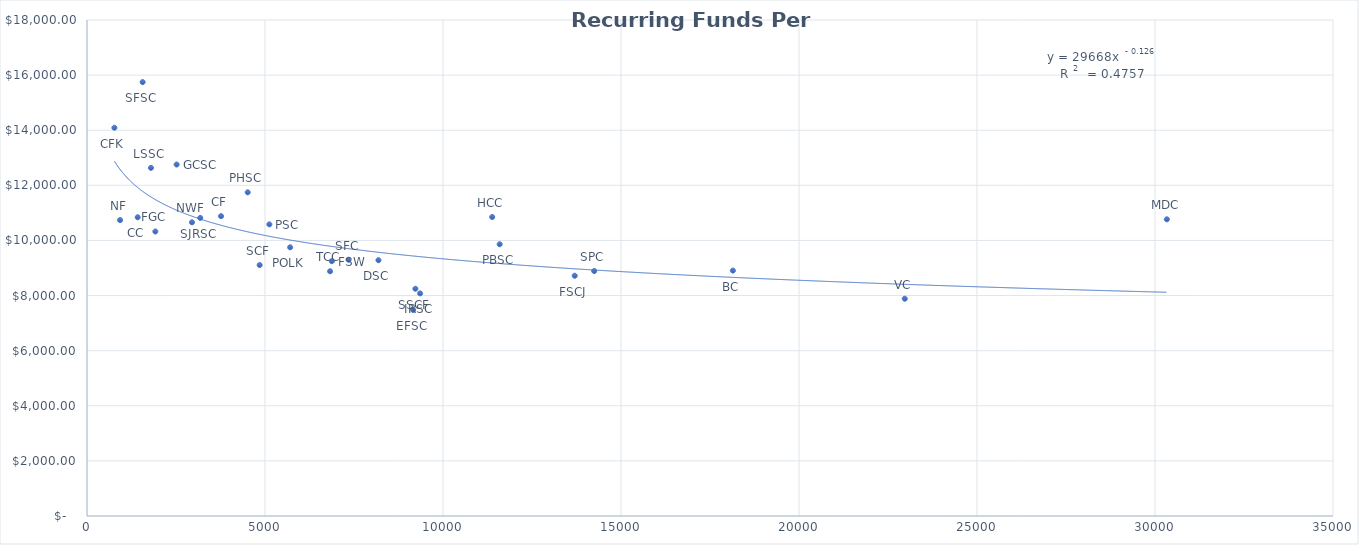
| Category |  Recurring Funds Per Graduate |
|---|---|
| 770.0 | 14090.101 |
| 929.0 | 10738.069 |
| 1424.0 | 10841.042 |
| 1563.0 | 15745.953 |
| 1797.0 | 12633.123 |
| 1920.0 | 10324.878 |
| 2518.0 | 12756.156 |
| 2949.0 | 10658.143 |
| 3181.0 | 10817.786 |
| 3765.0 | 10881.896 |
| 4514.0 | 11745.975 |
| 4850.0 | 9107.043 |
| 5123.0 | 10583.473 |
| 5707.0 | 9750.742 |
| 6828.0 | 8882.08 |
| 6878.0 | 9248.452 |
| 7350.0 | 9299.088 |
| 8187.0 | 9282.416 |
| 9160.0 | 7476.333 |
| 9225.0 | 8246.758 |
| 9357.0 | 8078.912 |
| 11382.0 | 10850.396 |
| 11592.0 | 9861.752 |
| 13700.0 | 8718.542 |
| 14247.0 | 8889.785 |
| 18143.0 | 8906.127 |
| 22971.0 | 7885.218 |
| 30334.0 | 10767.401 |